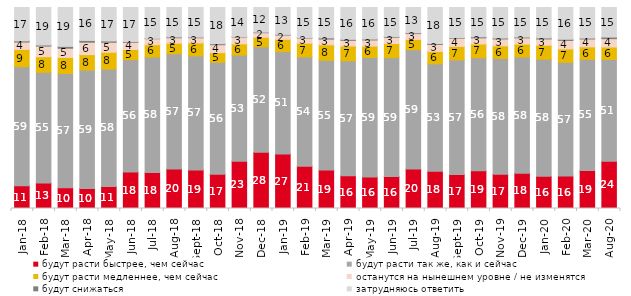
| Category | будут расти быстрее, чем сейчас | будут расти так же, как и сейчас | будут расти медленнее, чем сейчас | останутся на нынешнем уровне / не изменятся | будут снижаться | затрудняюсь ответить |
|---|---|---|---|---|---|---|
| 2018-01-01 | 11.35 | 59.2 | 8.6 | 3.65 | 0.6 | 16.6 |
| 2018-02-01 | 12.7 | 55.05 | 7.75 | 5.3 | 0.55 | 18.65 |
| 2018-03-01 | 10.3 | 56.85 | 8 | 4.6 | 0.9 | 19.35 |
| 2018-04-01 | 9.9 | 59 | 7.65 | 6.2 | 0.85 | 16.4 |
| 2018-05-01 | 10.95 | 58.4 | 8.4 | 4.95 | 0.65 | 16.65 |
| 2018-06-01 | 18.15 | 55.9 | 5.05 | 3.6 | 0.4 | 16.9 |
| 2018-07-01 | 17.85 | 57.5 | 6.15 | 2.95 | 0.2 | 15.35 |
| 2018-08-01 | 19.65 | 57.35 | 5.25 | 2.7 | 0.4 | 14.65 |
| 2018-09-01 | 19.1 | 56.85 | 6.4 | 2.6 | 0.3 | 14.75 |
| 2018-10-01 | 17.1 | 55.65 | 4.8 | 3.95 | 0.5 | 18 |
| 2018-11-01 | 23.453 | 52.894 | 5.539 | 3.443 | 0.2 | 14.471 |
| 2018-12-01 | 27.95 | 52.45 | 4.8 | 2.25 | 0.3 | 12.25 |
| 2019-01-01 | 27.15 | 50.9 | 6.1 | 2.15 | 0.3 | 13.4 |
| 2019-02-01 | 21.05 | 54.35 | 6.85 | 2.55 | 0.2 | 15 |
| 2019-03-01 | 19.095 | 54.649 | 7.708 | 2.834 | 0.597 | 15.117 |
| 2019-04-01 | 16.287 | 57.178 | 7.376 | 2.822 | 0.495 | 15.842 |
| 2019-05-01 | 15.701 | 59.435 | 5.646 | 3.071 | 0.446 | 15.701 |
| 2019-06-01 | 15.86 | 59.202 | 6.983 | 3.092 | 0.349 | 14.514 |
| 2019-07-01 | 19.604 | 59.406 | 5.099 | 2.921 | 0.396 | 12.574 |
| 2019-08-01 | 18.482 | 53.497 | 6.194 | 3.447 | 0.45 | 17.932 |
| 2019-09-01 | 16.881 | 57.079 | 6.683 | 4.01 | 0.297 | 15.05 |
| 2019-10-01 | 18.762 | 56.238 | 6.832 | 3.069 | 0.545 | 14.554 |
| 2019-11-01 | 17.03 | 57.673 | 6.238 | 3.416 | 0.446 | 15.198 |
| 2019-12-01 | 17.574 | 57.822 | 6.386 | 3.119 | 0.396 | 14.703 |
| 2020-01-01 | 15.99 | 58.267 | 6.98 | 3.119 | 0.495 | 15.149 |
| 2020-02-01 | 16.139 | 56.584 | 6.683 | 4.208 | 0.594 | 15.792 |
| 2020-03-01 | 18.939 | 55.28 | 6.197 | 3.917 | 0.446 | 15.221 |
| 2020-08-01 | 23.535 | 50.596 | 6.207 | 4.171 | 0.794 | 14.697 |